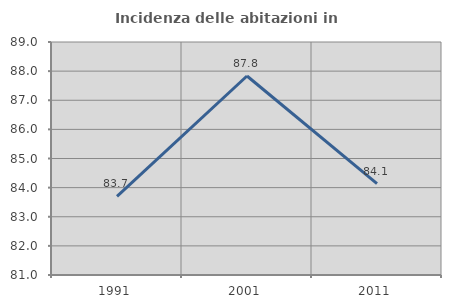
| Category | Incidenza delle abitazioni in proprietà  |
|---|---|
| 1991.0 | 83.698 |
| 2001.0 | 87.832 |
| 2011.0 | 84.137 |